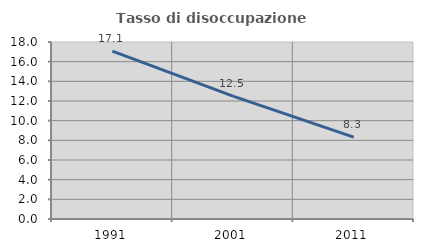
| Category | Tasso di disoccupazione giovanile  |
|---|---|
| 1991.0 | 17.073 |
| 2001.0 | 12.5 |
| 2011.0 | 8.333 |